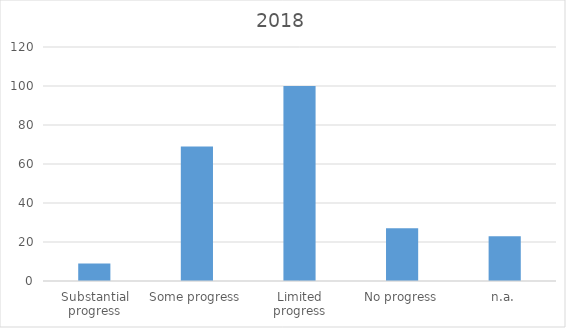
| Category | Total |
|---|---|
| Substantial progress | 9 |
| Some progress | 69 |
| Limited progress | 100 |
| No progress | 27 |
| n.a. | 23 |